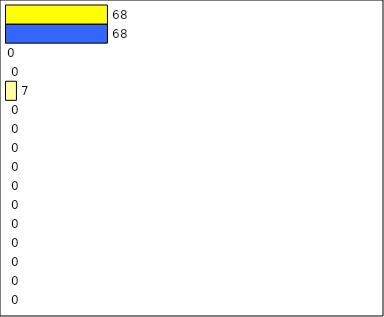
| Category | -2 | -1 | 0 | 1 | 2 | 3 | 4 | 5 | 6 | 7 | 8 | 9 | 10 | 11 | 12 | Perfect Round |
|---|---|---|---|---|---|---|---|---|---|---|---|---|---|---|---|---|
| 0 | 0 | 0 | 0 | 0 | 0 | 0 | 0 | 0 | 0 | 0 | 0 | 7 | 0 | 0 | 68 | 68 |